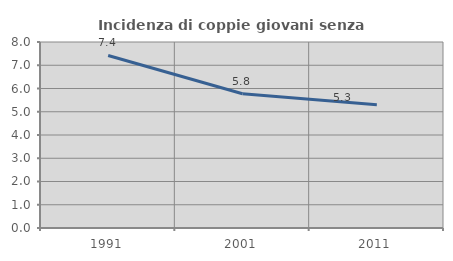
| Category | Incidenza di coppie giovani senza figli |
|---|---|
| 1991.0 | 7.42 |
| 2001.0 | 5.775 |
| 2011.0 | 5.3 |